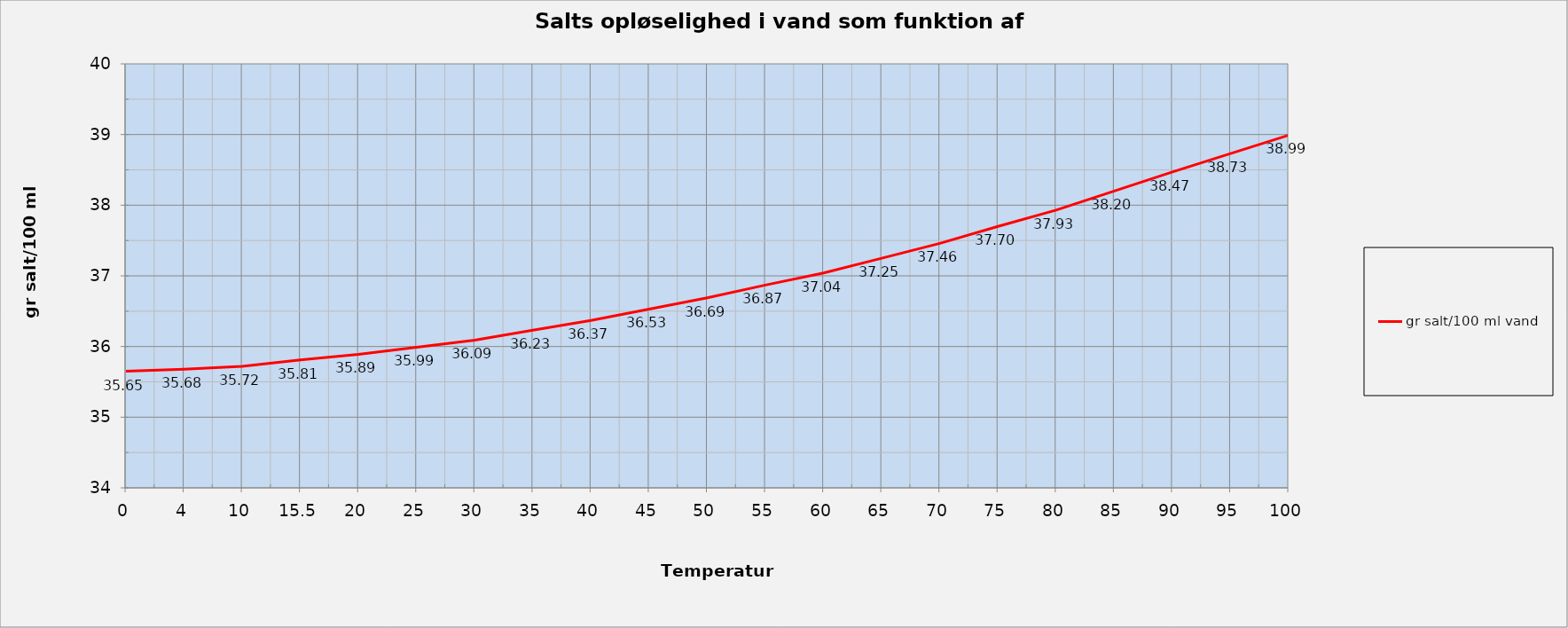
| Category | gr salt/100 ml vand |
|---|---|
| 0.0 | 35.65 |
| 4.0 | 35.68 |
| 10.0 | 35.72 |
| 15.5 | 35.81 |
| 20.0 | 35.89 |
| 25.0 | 35.99 |
| 30.0 | 36.09 |
| 35.0 | 36.23 |
| 40.0 | 36.37 |
| 45.0 | 36.53 |
| 50.0 | 36.69 |
| 55.0 | 36.87 |
| 60.0 | 37.04 |
| 65.0 | 37.25 |
| 70.0 | 37.46 |
| 75.0 | 37.7 |
| 80.0 | 37.93 |
| 85.0 | 38.2 |
| 90.0 | 38.47 |
| 95.0 | 38.73 |
| 100.0 | 38.99 |